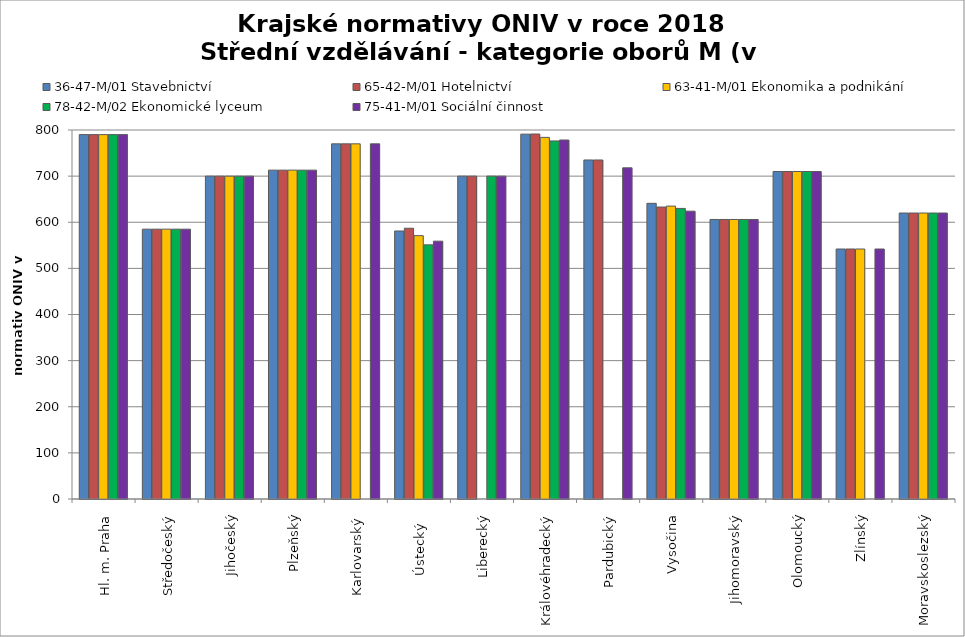
| Category | 36-47-M/01 Stavebnictví | 65-42-M/01 Hotelnictví | 63-41-M/01 Ekonomika a podnikání | 78-42-M/02 Ekonomické lyceum | 75-41-M/01 Sociální činnost |
|---|---|---|---|---|---|
| Hl. m. Praha | 790 | 790 | 790 | 790 | 790 |
| Středočeský | 585 | 585 | 585 | 585 | 585 |
| Jihočeský | 700 | 700 | 700 | 700 | 700 |
| Plzeňský | 713 | 713 | 713 | 713 | 713 |
| Karlovarský  | 770 | 770 | 770 | 0 | 770 |
| Ústecký   | 581 | 587 | 571 | 551 | 559 |
| Liberecký | 700 | 700 | 0 | 700 | 700 |
| Královéhradecký | 791 | 791.3 | 784 | 776.3 | 778.3 |
| Pardubický | 735 | 735 | 0 | 0 | 718 |
| Vysočina | 641 | 633 | 635 | 630 | 624 |
| Jihomoravský | 606 | 606 | 606 | 606 | 606 |
| Olomoucký | 710 | 710 | 710 | 710 | 710 |
| Zlínský | 542 | 542 | 542 | 0 | 542 |
| Moravskoslezský | 620 | 620 | 620 | 620 | 620 |